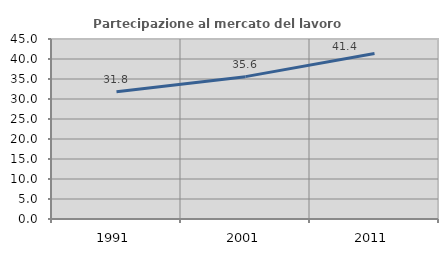
| Category | Partecipazione al mercato del lavoro  femminile |
|---|---|
| 1991.0 | 31.84 |
| 2001.0 | 35.591 |
| 2011.0 | 41.397 |